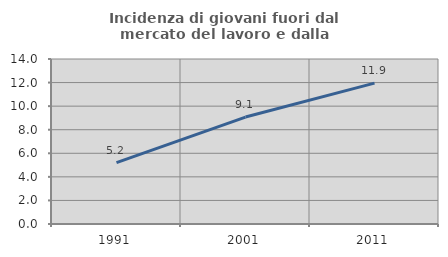
| Category | Incidenza di giovani fuori dal mercato del lavoro e dalla formazione  |
|---|---|
| 1991.0 | 5.202 |
| 2001.0 | 9.075 |
| 2011.0 | 11.95 |